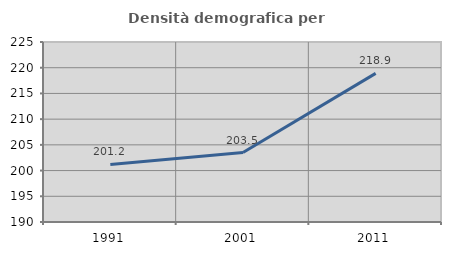
| Category | Densità demografica |
|---|---|
| 1991.0 | 201.184 |
| 2001.0 | 203.503 |
| 2011.0 | 218.906 |